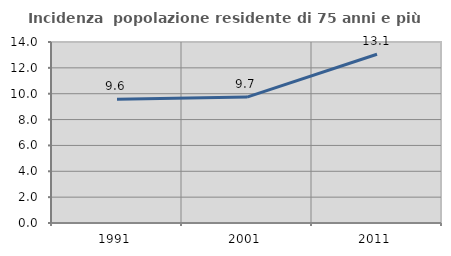
| Category | Incidenza  popolazione residente di 75 anni e più |
|---|---|
| 1991.0 | 9.579 |
| 2001.0 | 9.741 |
| 2011.0 | 13.05 |